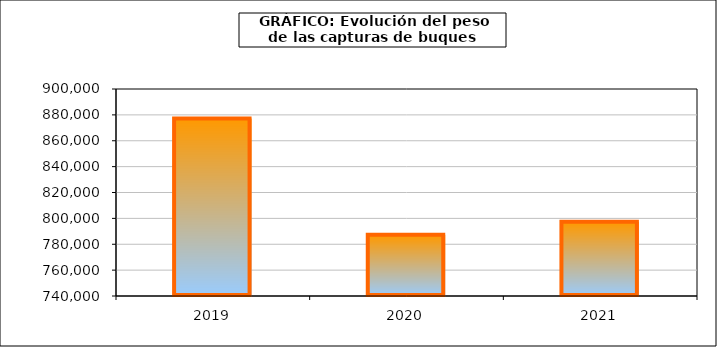
| Category | Series1 |
|---|---|
| 2019.0 | 877211.749 |
| 2020.0 | 787257.944 |
| 2021.0 | 797341.83 |